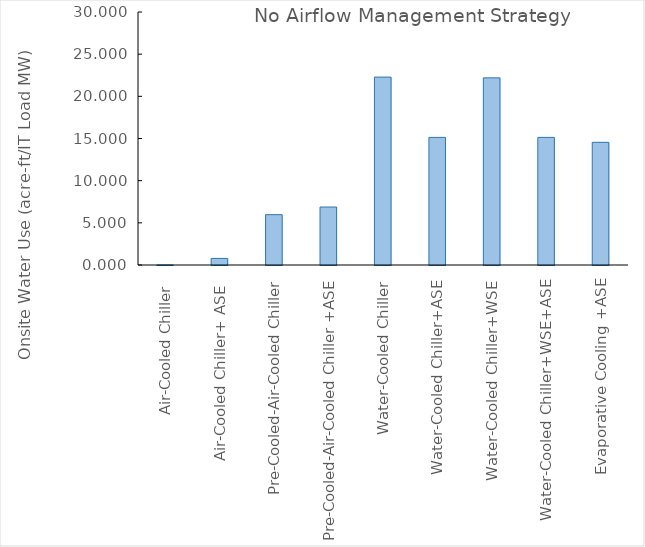
| Category | Series 0 |
|---|---|
| Air-Cooled Chiller  | 0.003 |
| Air-Cooled Chiller+ ASE  | 0.782 |
| Pre-Cooled-Air-Cooled Chiller | 5.968 |
| Pre-Cooled-Air-Cooled Chiller +ASE | 6.874 |
| Water-Cooled Chiller | 22.28 |
| Water-Cooled Chiller+ASE | 15.13 |
| Water-Cooled Chiller+WSE | 22.19 |
| Water-Cooled Chiller+WSE+ASE | 15.13 |
| Evaporative Cooling +ASE | 14.545 |